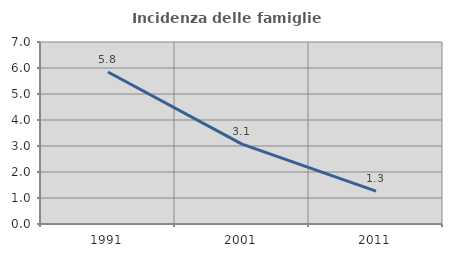
| Category | Incidenza delle famiglie numerose |
|---|---|
| 1991.0 | 5.846 |
| 2001.0 | 3.073 |
| 2011.0 | 1.261 |